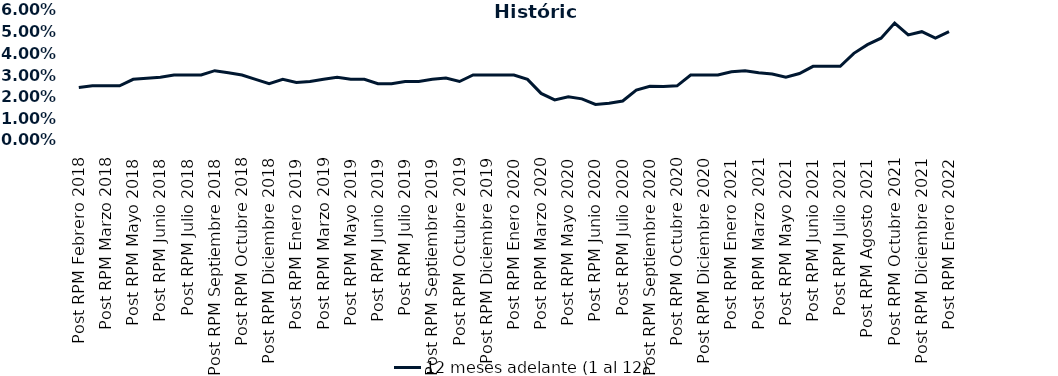
| Category | 12 meses adelante (1 al 12)  |
|---|---|
| Post RPM Febrero 2018 | 0.024 |
| Pre RPM Marzo 2018 | 0.025 |
| Post RPM Marzo 2018 | 0.025 |
| Pre RPM Mayo 2018 | 0.025 |
| Post RPM Mayo 2018 | 0.028 |
| Pre RPM Junio 2018 | 0.028 |
| Post RPM Junio 2018 | 0.029 |
| Pre RPM Julio 2018 | 0.03 |
| Post RPM Julio 2018 | 0.03 |
| Pre RPM Septiembre 2018 | 0.03 |
| Post RPM Septiembre 2018 | 0.032 |
| Pre RPM Octubre 2018 | 0.031 |
| Post RPM Octubre 2018 | 0.03 |
| Pre RPM Diciembre 2018 | 0.028 |
| Post RPM Diciembre 2018 | 0.026 |
| Pre RPM Enero 2019 | 0.028 |
| Post RPM Enero 2019 | 0.026 |
| Pre RPM Marzo 2019 | 0.027 |
| Post RPM Marzo 2019 | 0.028 |
| Pre RPM Mayo 2019 | 0.029 |
| Post RPM Mayo 2019 | 0.028 |
| Pre RPM Junio 2019 | 0.028 |
| Post RPM Junio 2019 | 0.026 |
| Pre RPM Julio 2019 | 0.026 |
| Post RPM Julio 2019 | 0.027 |
| Pre RPM Septiembre 2019 | 0.027 |
| Post RPM Septiembre 2019 | 0.028 |
| Pre RPM Octubre 2019 | 0.029 |
| Post RPM Octubre 2019 | 0.027 |
| Pre RPM Diciembre 2019 | 0.03 |
| Post RPM Diciembre 2019 | 0.03 |
| Pre RPM Enero 2020 | 0.03 |
| Post RPM Enero 2020 | 0.03 |
| Pre RPM Marzo 2020 | 0.028 |
| Post RPM Marzo 2020 | 0.022 |
| Pre RPM Mayo 2020 | 0.018 |
| Post RPM Mayo 2020 | 0.02 |
| Pre RPM Junio 2020 | 0.019 |
| Post RPM Junio 2020 | 0.016 |
| Pre RPM Julio 2020 | 0.017 |
| Post RPM Julio 2020 | 0.018 |
| Pre RPM Septiembre 2020 | 0.023 |
| Post RPM Septiembre 2020 | 0.025 |
| Pre RPM Octubre 2020 | 0.025 |
| Post RPM Octubre 2020 | 0.025 |
| Pre RPM Diciembre 2020 | 0.03 |
| Post RPM Diciembre 2020 | 0.03 |
| Pre RPM Enero 2021 | 0.03 |
| Post RPM Enero 2021 | 0.032 |
| Pre RPM Marzo 2021 | 0.032 |
| Post RPM Marzo 2021 | 0.031 |
| Pre RPM Mayo 2021 | 0.03 |
| Post RPM Mayo 2021 | 0.029 |
| Pre RPM Junio 2021 | 0.031 |
| Post RPM Junio 2021 | 0.034 |
| Pre RPM Julio 2021 | 0.034 |
| Post RPM Julio 2021 | 0.034 |
| Pre RPM Agosto 2021 | 0.04 |
| Post RPM Agosto 2021 | 0.044 |
| Pre RPM Octubre 2021 | 0.047 |
| Post RPM Octubre 2021 | 0.054 |
| Pre RPM Diciembre 2021 | 0.048 |
| Post RPM Diciembre 2021 | 0.05 |
| Pre RPM Enero 2022 | 0.047 |
| Post RPM Enero 2022 | 0.05 |